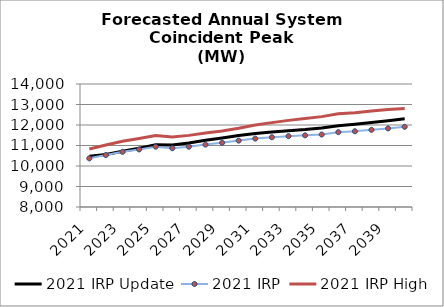
| Category | 2021 IRP Update | 2021 IRP | 2021 IRP High |
|---|---|---|---|
| 2021.0 | 10471.902 | 10373.619 | 10830.76 |
| 2022.0 | 10561.334 | 10535.441 | 11023.247 |
| 2023.0 | 10717.346 | 10691.366 | 11210.292 |
| 2024.0 | 10863.629 | 10807.838 | 11343.665 |
| 2025.0 | 11034.897 | 10942.272 | 11482.4 |
| 2026.0 | 11027.225 | 10866.996 | 11412.307 |
| 2027.0 | 11125.68 | 10939.547 | 11493.772 |
| 2028.0 | 11255.033 | 11043.349 | 11607.67 |
| 2029.0 | 11369.65 | 11133.15 | 11710.228 |
| 2030.0 | 11486.688 | 11238.494 | 11836.911 |
| 2031.0 | 11589.625 | 11337.243 | 11995.18 |
| 2032.0 | 11658.097 | 11401.562 | 12115.241 |
| 2033.0 | 11721.658 | 11455.422 | 12226.153 |
| 2034.0 | 11775.861 | 11495.573 | 12317.534 |
| 2035.0 | 11851.66 | 11534.846 | 12408.774 |
| 2036.0 | 11966.457 | 11649.535 | 12551.689 |
| 2037.0 | 12040.473 | 11695.399 | 12599.383 |
| 2038.0 | 12122.133 | 11764.188 | 12685.272 |
| 2039.0 | 12210.258 | 11833.412 | 12754.088 |
| 2040.0 | 12304.877 | 11912.041 | 12802.161 |